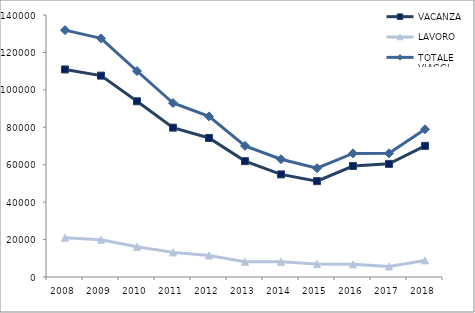
| Category | VACANZA | LAVORO | TOTALE VIAGGI |
|---|---|---|---|
| 2008 | 110901 | 21026 | 131928 |
| 2009 | 107603 | 19931 | 127533 |
| 2010 | 93894 | 16179 | 110073 |
| 2011 | 79811 | 13160 | 92971 |
| 2012 | 74301 | 11524 | 85825 |
| 2013 | 61916 | 8167 | 70083 |
| 2014 | 54816 | 8112 | 62927 |
| 2015 | 51222 | 6894 | 58115 |
| 2016 | 59298 | 6757 | 66055 |
| 2017 | 60455 | 5626 | 66081 |
| 2018 | 70070 | 8870 | 78940 |